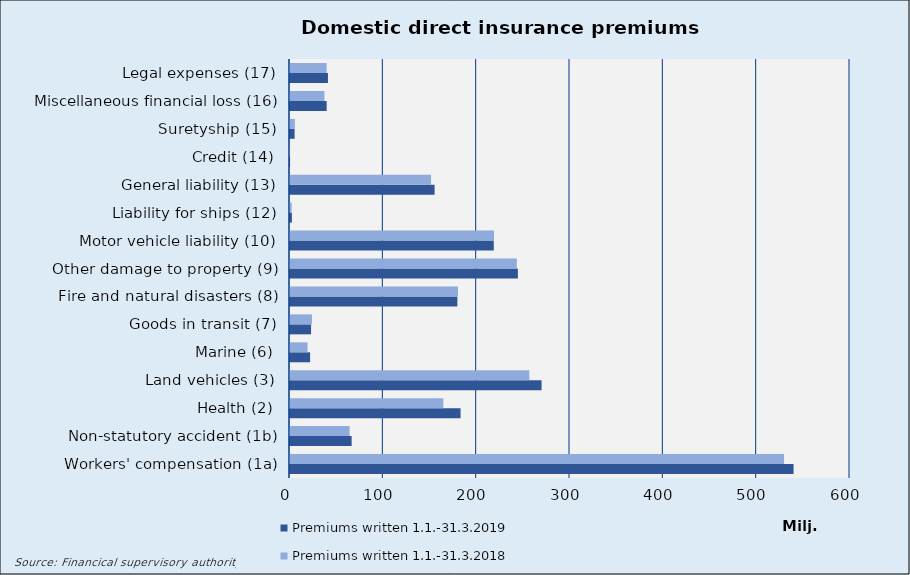
| Category | Premiums written |
|---|---|
| Workers' compensation (1a) | 529351.97 |
| Non-statutory accident (1b) | 63873.597 |
| Health (2) | 164281.486 |
| Land vehicles (3) | 256416.491 |
| Marine (6) | 18856.443 |
| Goods in transit (7) | 23513.692 |
| Fire and natural disasters (8) | 179946.903 |
| Other damage to property (9) | 243022.5 |
| Motor vehicle liability (10) | 218547.141 |
| Liability for ships (12) | 1778.564 |
| General liability (13) | 151094.226 |
| Credit (14) | 67.372 |
| Suretyship (15) | 5215.313 |
| Miscellaneous financial loss (16) | 36846.547 |
| Legal expenses (17) | 39228.599 |